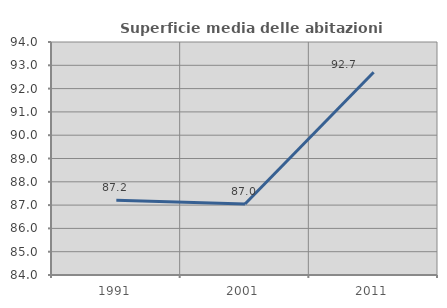
| Category | Superficie media delle abitazioni occupate |
|---|---|
| 1991.0 | 87.211 |
| 2001.0 | 87.049 |
| 2011.0 | 92.703 |